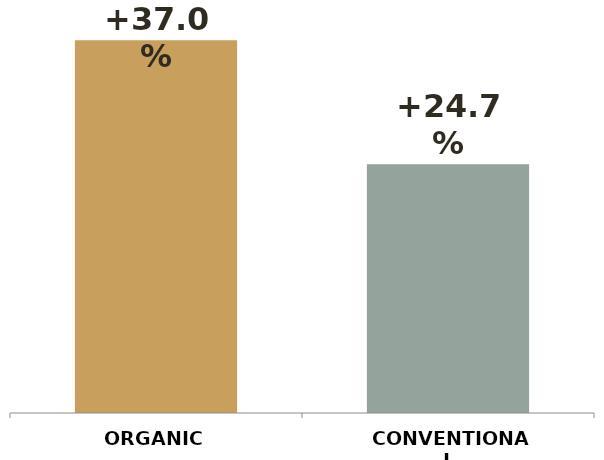
| Category | Series 0 |
|---|---|
| ORGANIC | 0.37 |
| CONVENTIONAL | 0.247 |